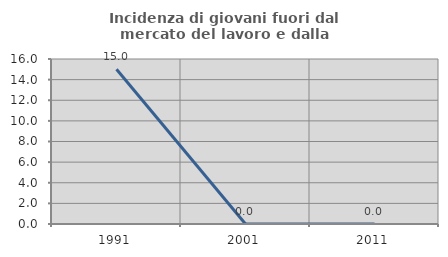
| Category | Incidenza di giovani fuori dal mercato del lavoro e dalla formazione  |
|---|---|
| 1991.0 | 15 |
| 2001.0 | 0 |
| 2011.0 | 0 |